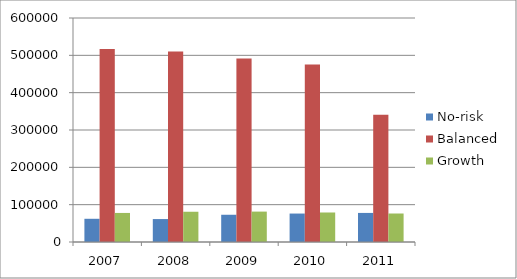
| Category | No-risk | Balanced | Growth |
|---|---|---|---|
| 2007.0 | 62180 | 516842 | 77825 |
| 2008.0 | 61429 | 510599 | 81030 |
| 2009.0 | 72971 | 491381 | 81432 |
| 2010.0 | 76204 | 475660 | 79040 |
| 2011.0 | 77878 | 340864 | 76330 |